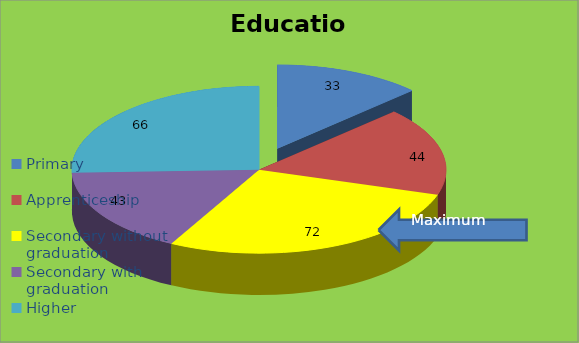
| Category | The number of responses |
|---|---|
| Primary | 33 |
| Apprenticeship | 44 |
| Secondary without graduation | 72 |
| Secondary with graduation | 43 |
| Higher | 66 |